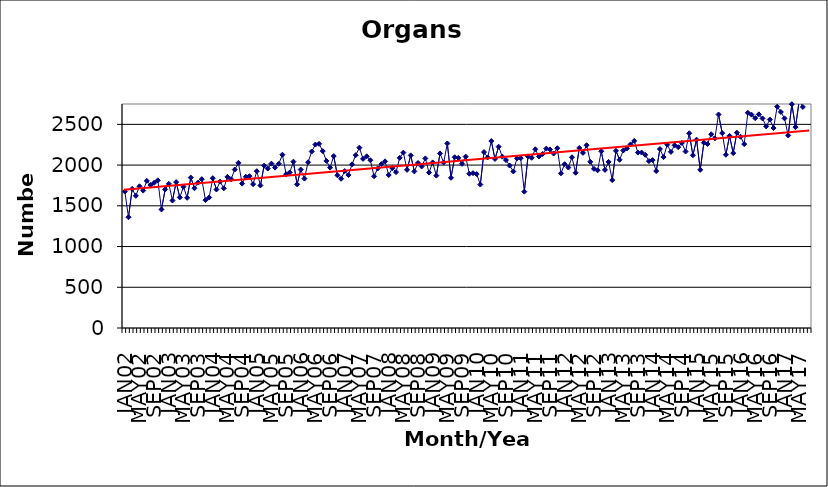
| Category | Series 0 |
|---|---|
| JAN02 | 1675 |
| FEB02 | 1360 |
| MAR02 | 1708 |
| APR02 | 1623 |
| MAY02 | 1740 |
| JUN02 | 1687 |
| JUL02 | 1806 |
| AUG02 | 1755 |
| SEP02 | 1783 |
| OCT02 | 1813 |
| NOV02 | 1455 |
| DEC02 | 1701 |
| JAN03 | 1770 |
| FEB03 | 1565 |
| MAR03 | 1791 |
| APR03 | 1603 |
| MAY03 | 1734 |
| JUN03 | 1598 |
| JUL03 | 1847 |
| AUG03 | 1716 |
| SEP03 | 1785 |
| OCT03 | 1827 |
| NOV03 | 1570 |
| DEC03 | 1602 |
| JAN04 | 1839 |
| FEB04 | 1700 |
| MAR04 | 1797 |
| APR04 | 1715 |
| MAY04 | 1855 |
| JUN04 | 1827 |
| JUL04 | 1945 |
| AUG04 | 2028 |
| SEP04 | 1773 |
| OCT04 | 1857 |
| NOV04 | 1864 |
| DEC04 | 1766 |
| JAN05 | 1925 |
| FEB05 | 1750 |
| MAR05 | 1993 |
| APR05 | 1957 |
| MAY05 | 2018 |
| JUN05 | 1969 |
| JUL05 | 2016 |
| AUG05 | 2127 |
| SEP05 | 1888 |
| OCT05 | 1910 |
| NOV05 | 2042 |
| DEC05 | 1764 |
| JAN06 | 1945 |
| FEB06 | 1834 |
| MAR06 | 2035 |
| APR06 | 2167 |
| MAY06 | 2252 |
| JUN06 | 2261 |
| JUL06 | 2172 |
| AUG06 | 2051 |
| SEP06 | 1969 |
| OCT06 | 2111 |
| NOV06 | 1875 |
| DEC06 | 1832 |
| JAN07 | 1927 |
| FEB07 | 1878 |
| MAR07 | 2009 |
| APR07 | 2122 |
| MAY07 | 2214 |
| JUN07 | 2076 |
| JUL07 | 2108 |
| AUG07 | 2060 |
| SEP07 | 1863 |
| OCT07 | 1959 |
| NOV07 | 2012 |
| DEC07 | 2046 |
| JAN08 | 1878 |
| FEB08 | 1962 |
| MAR08 | 1914 |
| APR08 | 2089 |
| MAY08 | 2153 |
| JUN08 | 1942 |
| JUL08 | 2119 |
| AUG08 | 1923 |
| SEP08 | 2026 |
| OCT08 | 1983 |
| NOV08 | 2082 |
| DEC08 | 1908 |
| JAN09 | 2033 |
| FEB09 | 1871 |
| MAR09 | 2143 |
| APR09 | 2032 |
| MAY09 | 2266 |
| JUN09 | 1844 |
| JUL09 | 2096 |
| AUG09 | 2089 |
| SEP09 | 2016 |
| OCT09 | 2104 |
| NOV09 | 1894 |
| DEC09 | 1901 |
| JAN10 | 1890 |
| FEB10 | 1761 |
| MAR10 | 2160 |
| APR10 | 2094 |
| MAY10 | 2295 |
| JUN10 | 2075 |
| JUL10 | 2226 |
| AUG10 | 2104 |
| SEP10 | 2062 |
| OCT10 | 1994 |
| NOV10 | 1922 |
| DEC10 | 2082 |
| JAN11 | 2085 |
| FEB11 | 1674 |
| MAR11 | 2106 |
| APR11 | 2090 |
| MAY11 | 2194 |
| JUN11 | 2105 |
| JUL11 | 2136 |
| AUG11 | 2202 |
| SEP11 | 2192 |
| OCT11 | 2142 |
| NOV11 | 2207 |
| DEC11 | 1899 |
| JAN12 | 2011 |
| FEB12 | 1970 |
| MAR12 | 2096 |
| APR12 | 1906 |
| MAY12 | 2210 |
| JUN12 | 2150 |
| JUL12 | 2244 |
| AUG12 | 2041 |
| SEP12 | 1954 |
| OCT12 | 1936 |
| NOV12 | 2170 |
| DEC12 | 1941 |
| JAN13 | 2039 |
| FEB13 | 1816 |
| MAR13 | 2175 |
| APR13 | 2065 |
| MAY13 | 2179 |
| JUN13 | 2205 |
| JUL13 | 2254 |
| AUG13 | 2297 |
| SEP13 | 2154 |
| OCT13 | 2154 |
| NOV13 | 2126 |
| DEC13 | 2049 |
| JAN14 | 2061 |
| FEB14 | 1927 |
| MAR14 | 2197 |
| APR14 | 2098 |
| MAY14 | 2251 |
| JUN14 | 2162 |
| JUL14 | 2243 |
| AUG14 | 2220 |
| SEP14 | 2272 |
| OCT14 | 2167 |
| NOV14 | 2391 |
| DEC14 | 2121 |
| JAN15 | 2312 |
| FEB15 | 1942 |
| MAR15 | 2275 |
| APR15 | 2259 |
| MAY15 | 2379 |
| JUN15 | 2328 |
| JUL15 | 2621 |
| AUG15 | 2393 |
| SEP15 | 2127 |
| OCT15 | 2359 |
| NOV15 | 2147 |
| DEC15 | 2398 |
| JAN16 | 2348 |
| FEB16 | 2258 |
| MAR16 | 2642 |
| APR16 | 2619 |
| MAY16 | 2576 |
| JUN16 | 2623 |
| JUL16 | 2573 |
| AUG16 | 2475 |
| SEP16 | 2559 |
| OCT16 | 2455 |
| NOV16 | 2717 |
| DEC16 | 2652 |
| JAN17 | 2574 |
| FEB17 | 2364 |
| MAR17 | 2748 |
| APR17 | 2466 |
| MAY17 | 2787 |
| JUN17 | 2714 |